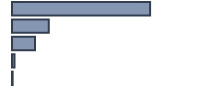
| Category | Series 0 |
|---|---|
| 0 | 68.705 |
| 1 | 18.295 |
| 2 | 11.419 |
| 3 | 1.262 |
| 4 | 0.319 |